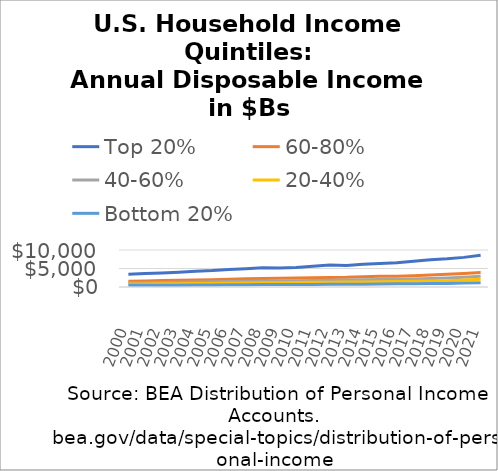
| Category | Top 20% | 60-80% | 40-60% | 20-40% | Bottom 20% |
|---|---|---|---|---|---|
| 2000.0 | 3419.703 | 1581.532 | 1131.048 | 785.838 | 440.065 |
| 2001.0 | 3617.066 | 1653.001 | 1180.484 | 824.074 | 461.714 |
| 2002.0 | 3791.151 | 1735.351 | 1235.736 | 854.168 | 470.406 |
| 2003.0 | 3976.408 | 1844.858 | 1285.764 | 882.962 | 480.391 |
| 2004.0 | 4255.439 | 1922.08 | 1339.336 | 932.532 | 510.1 |
| 2005.0 | 4429.824 | 1987.671 | 1402.48 | 971.025 | 528.221 |
| 2006.0 | 4742.103 | 2089.63 | 1466.515 | 1037.437 | 590.36 |
| 2007.0 | 4921.365 | 2216.716 | 1563.952 | 1099.327 | 622.306 |
| 2008.0 | 5170.622 | 2319.025 | 1640.377 | 1138.153 | 648.799 |
| 2009.0 | 5119.905 | 2337.22 | 1628.066 | 1170.22 | 654.874 |
| 2010.0 | 5264.145 | 2416.188 | 1721.698 | 1228.065 | 685.836 |
| 2011.0 | 5628.585 | 2501.702 | 1764.314 | 1253.672 | 704.907 |
| 2012.0 | 5957.553 | 2594.925 | 1820.532 | 1290.013 | 734.989 |
| 2013.0 | 5838.666 | 2619.286 | 1868.598 | 1318.352 | 737.354 |
| 2014.0 | 6178.962 | 2753.55 | 1929.257 | 1376.518 | 752.146 |
| 2015.0 | 6368.949 | 2872.063 | 2026.653 | 1443.837 | 820.474 |
| 2016.0 | 6573.401 | 2933.949 | 2075.222 | 1495.979 | 850.102 |
| 2017.0 | 6937.533 | 3072.051 | 2174.827 | 1547.811 | 879.91 |
| 2018.0 | 7338.892 | 3239.459 | 2298.43 | 1644.5 | 923.284 |
| 2019.0 | 7622.049 | 3415.108 | 2433.235 | 1721.26 | 960.778 |
| 2020.0 | 8006.972 | 3639.432 | 2651.179 | 1913.306 | 1066.423 |
| 2021.0 | 8565.267 | 3901.526 | 2883.128 | 2093.176 | 1175.69 |